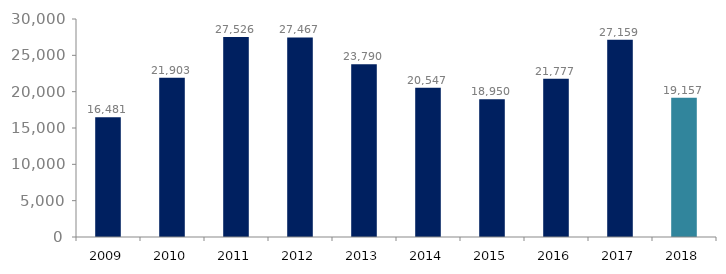
| Category | Series 1 |
|---|---|
| 2009.0 | 16481 |
| 2010.0 | 21903 |
| 2011.0 | 27526 |
| 2012.0 | 27467 |
| 2013.0 | 23790 |
| 2014.0 | 20547 |
| 2015.0 | 18950.14 |
| 2016.0 | 21776.636 |
| 2017.0 | 27158.582 |
| 2018.0 | 19156.571 |